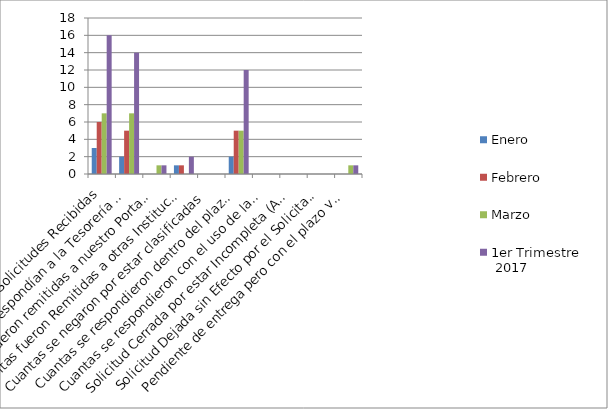
| Category | Enero | Febrero | Marzo | 1er Trimestre
 2017 |
|---|---|---|---|---|
| Total de Solicitudes Recibidas | 3 | 6 | 7 | 16 |
| Cuantas le correspondían a la Tesorería Nacional | 2 | 5 | 7 | 14 |
| Cuantas fueron remitidas a nuestro Portal Web   | 0 | 0 | 1 | 1 |
| Cuantas fueron Remitidas a otras Instituciones | 1 | 1 | 0 | 2 |
| Cuantas se negaron por estar clasificadas | 0 | 0 | 0 | 0 |
| Cuantas se respondieron dentro del plazo de los 15 días laborables | 2 | 5 | 5 | 12 |
| Cuantas se respondieron con el uso de la prórroga de 10 días | 0 | 0 | 0 | 0 |
| Solicitud Cerrada por estar Incompleta (Art. 17,Reglamento 130-05) | 0 | 0 | 0 | 0 |
| Solicitud Dejada sin Efecto por el Solicitante | 0 | 0 | 0 | 0 |
| Pendiente de entrega pero con el plazo vigente | 0 | 0 | 1 | 1 |